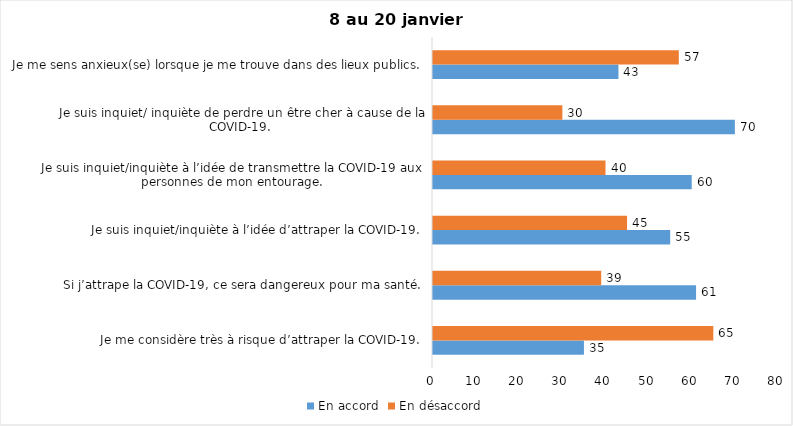
| Category | En accord | En désaccord |
|---|---|---|
| Je me considère très à risque d’attraper la COVID-19. | 35 | 65 |
| Si j’attrape la COVID-19, ce sera dangereux pour ma santé. | 61 | 39 |
| Je suis inquiet/inquiète à l’idée d’attraper la COVID-19. | 55 | 45 |
| Je suis inquiet/inquiète à l’idée de transmettre la COVID-19 aux personnes de mon entourage. | 60 | 40 |
| Je suis inquiet/ inquiète de perdre un être cher à cause de la COVID-19. | 70 | 30 |
| Je me sens anxieux(se) lorsque je me trouve dans des lieux publics. | 43 | 57 |